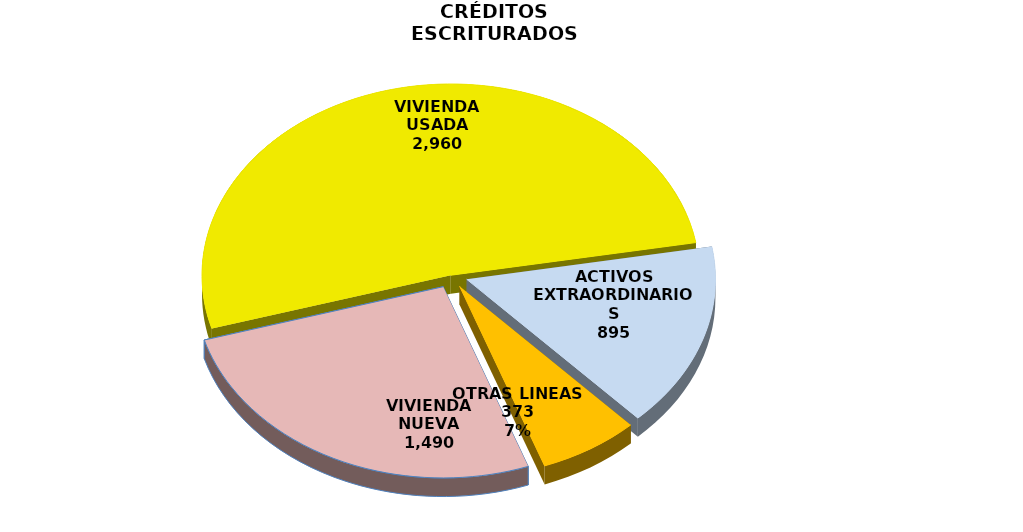
| Category | Series 0 |
|---|---|
| VIVIENDA NUEVA | 1490 |
| VIVIENDA USADA | 2960 |
| ACTIVOS EXTRAORDINARIOS | 895 |
| OTRAS LINEAS | 373 |